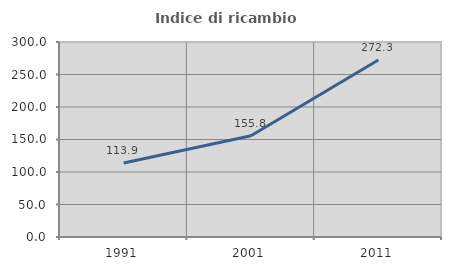
| Category | Indice di ricambio occupazionale  |
|---|---|
| 1991.0 | 113.871 |
| 2001.0 | 155.839 |
| 2011.0 | 272.253 |